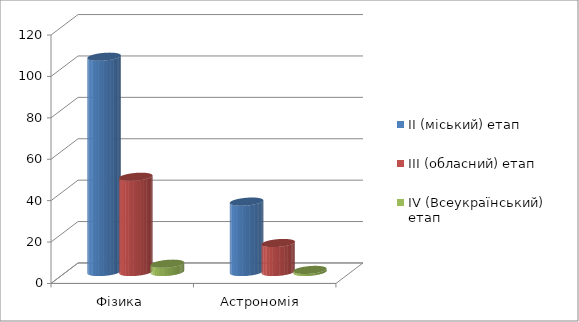
| Category | ІІ (міський) етап | ІІІ (обласний) етап | ІV (Всеукраїнський) етап |
|---|---|---|---|
| Фізика | 104 | 46 | 4 |
| Астрономія  | 34 | 14 | 1 |